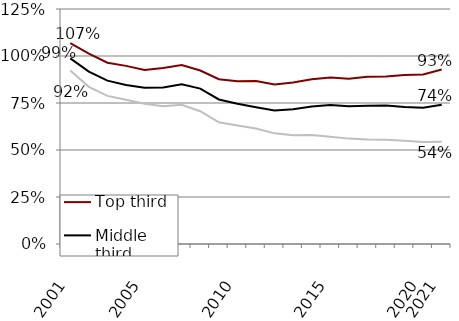
| Category | Top third | Middle third | Bottom third |
|---|---|---|---|
| 2001.0 | 1.069 | 0.988 | 0.923 |
| nan | 1.012 | 0.917 | 0.836 |
| nan | 0.964 | 0.869 | 0.788 |
| nan | 0.948 | 0.845 | 0.767 |
| 2005.0 | 0.926 | 0.832 | 0.746 |
| nan | 0.936 | 0.833 | 0.732 |
| nan | 0.953 | 0.85 | 0.741 |
| nan | 0.923 | 0.827 | 0.706 |
| nan | 0.876 | 0.769 | 0.648 |
| 2010.0 | 0.866 | 0.746 | 0.63 |
| nan | 0.867 | 0.728 | 0.614 |
| nan | 0.849 | 0.71 | 0.589 |
| nan | 0.859 | 0.716 | 0.579 |
| nan | 0.876 | 0.731 | 0.58 |
| 2015.0 | 0.886 | 0.739 | 0.571 |
| nan | 0.88 | 0.732 | 0.561 |
| nan | 0.89 | 0.735 | 0.556 |
| nan | 0.891 | 0.736 | 0.555 |
| nan | 0.898 | 0.729 | 0.55 |
| 2020.0 | 0.902 | 0.725 | 0.542 |
| 2021.0 | 0.928 | 0.741 | 0.544 |